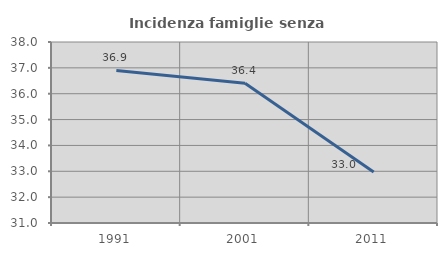
| Category | Incidenza famiglie senza nuclei |
|---|---|
| 1991.0 | 36.898 |
| 2001.0 | 36.404 |
| 2011.0 | 32.975 |